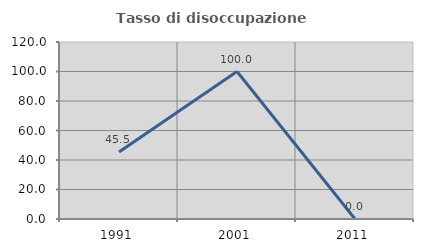
| Category | Tasso di disoccupazione giovanile  |
|---|---|
| 1991.0 | 45.455 |
| 2001.0 | 100 |
| 2011.0 | 0 |